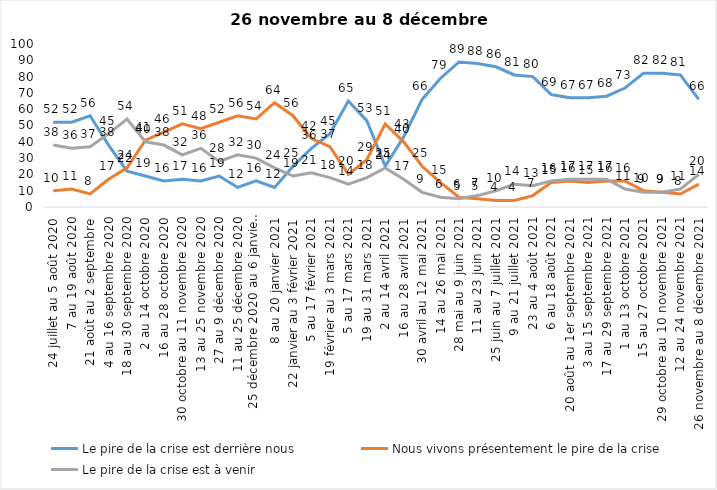
| Category | Le pire de la crise est derrière nous | Nous vivons présentement le pire de la crise | Le pire de la crise est à venir |
|---|---|---|---|
| 24 juillet au 5 août 2020 | 52 | 10 | 38 |
| 7 au 19 août 2020 | 52 | 11 | 36 |
| 21 août au 2 septembre | 56 | 8 | 37 |
| 4 au 16 septembre 2020 | 38 | 17 | 45 |
| 18 au 30 septembre 2020 | 22 | 24 | 54 |
| 2 au 14 octobre 2020 | 19 | 41 | 40 |
| 16 au 28 octobre 2020 | 16 | 46 | 38 |
| 30 octobre au 11 novembre 2020 | 17 | 51 | 32 |
| 13 au 25 novembre 2020 | 16 | 48 | 36 |
| 27 au 9 décembre 2020 | 19 | 52 | 28 |
| 11 au 25 décembre 2020 | 12 | 56 | 32 |
| 25 décembre 2020 au 6 janvier 2021 | 16 | 54 | 30 |
| 8 au 20 janvier 2021 | 12 | 64 | 24 |
| 22 janvier au 3 février 2021 | 25 | 56 | 19 |
| 5 au 17 février 2021 | 36 | 42 | 21 |
| 19 février au 3 mars 2021 | 45 | 37 | 18 |
| 5 au 17 mars 2021 | 65 | 20 | 14 |
| 19 au 31 mars 2021 | 53 | 29 | 18 |
| 2 au 14 avril 2021 | 25 | 51 | 24 |
| 16 au 28 avril 2021 | 43 | 40 | 17 |
| 30 avril au 12 mai 2021 | 66 | 25 | 9 |
| 14 au 26 mai 2021 | 79 | 15 | 6 |
| 28 mai au 9 juin 2021 | 89 | 6 | 5 |
| 11 au 23 juin 2021 | 88 | 5 | 7 |
| 25 juin au 7 juillet 2021 | 86 | 4 | 10 |
| 9 au 21 juillet 2021 | 81 | 4 | 14 |
| 23 au 4 août 2021 | 80 | 7 | 13 |
| 6 au 18 août 2021 | 69 | 15 | 16 |
| 20 août au 1er septembre 2021 | 67 | 16 | 17 |
| 3 au 15 septembre 2021 | 67 | 15 | 17 |
| 17 au 29 septembre 2021 | 68 | 16 | 17 |
| 1 au 13 octobre 2021 | 73 | 16 | 11 |
| 15 au 27 octobre 2021 | 82 | 10 | 9 |
| 29 octobre au 10 novembre 2021 | 82 | 9 | 9 |
| 12 au 24 novembre 2021 | 81 | 8 | 11 |
| 26 novembre au 8 décembre 2021 | 66 | 14 | 20 |